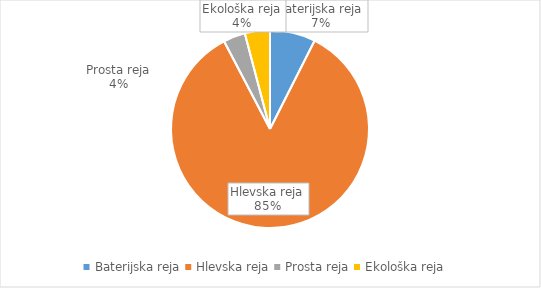
| Category | Količina kosov jajc |
|---|---|
| Baterijska reja | 264135 |
| Hlevska reja | 3013818 |
| Prosta reja | 126863 |
| Ekološka reja | 145744 |